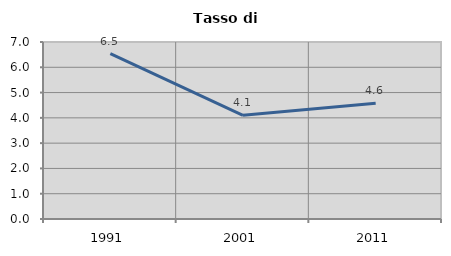
| Category | Tasso di disoccupazione   |
|---|---|
| 1991.0 | 6.537 |
| 2001.0 | 4.1 |
| 2011.0 | 4.577 |